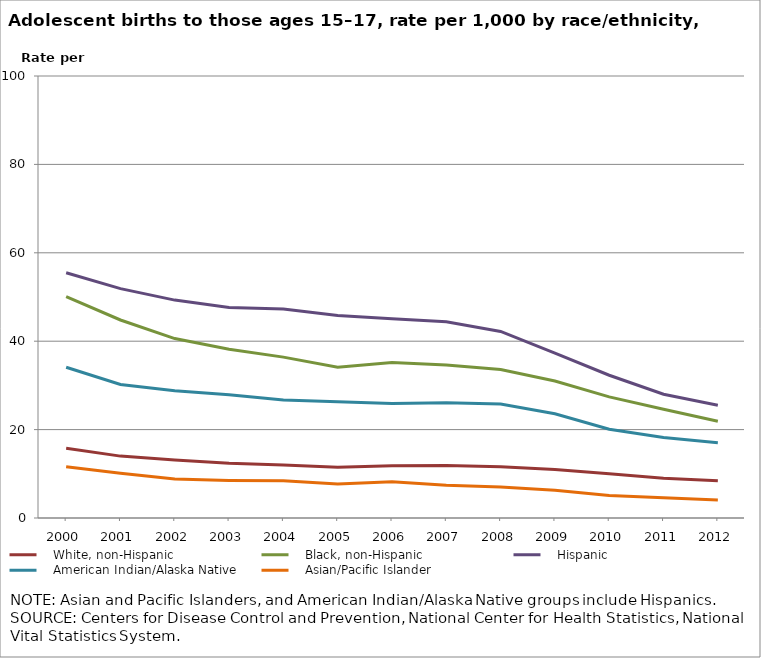
| Category |    White, non-Hispanic |    Black, non-Hispanic  |    Hispanic |    American Indian/Alaska Native |    Asian/Pacific Islander |
|---|---|---|---|---|---|
| 2000.0 | 15.8 | 50.1 | 55.5 | 34.1 | 11.6 |
| 2001.0 | 14 | 44.8 | 51.9 | 30.2 | 10.1 |
| 2002.0 | 13.1 | 40.6 | 49.3 | 28.8 | 8.8 |
| 2003.0 | 12.4 | 38.2 | 47.6 | 27.9 | 8.5 |
| 2004.0 | 12 | 36.4 | 47.3 | 26.7 | 8.4 |
| 2005.0 | 11.5 | 34.1 | 45.8 | 26.3 | 7.7 |
| 2006.0 | 11.8 | 35.2 | 45.1 | 25.9 | 8.2 |
| 2007.0 | 11.9 | 34.6 | 44.4 | 26.1 | 7.4 |
| 2008.0 | 11.6 | 33.6 | 42.2 | 25.8 | 7 |
| 2009.0 | 11 | 31 | 37.3 | 23.6 | 6.3 |
| 2010.0 | 10 | 27.4 | 32.3 | 20.1 | 5.1 |
| 2011.0 | 9 | 24.6 | 28 | 18.2 | 4.6 |
| 2012.0 | 8.4 | 21.9 | 25.5 | 17 | 4.1 |